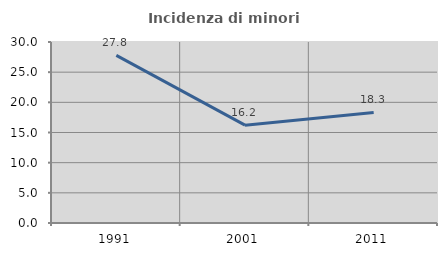
| Category | Incidenza di minori stranieri |
|---|---|
| 1991.0 | 27.778 |
| 2001.0 | 16.216 |
| 2011.0 | 18.317 |